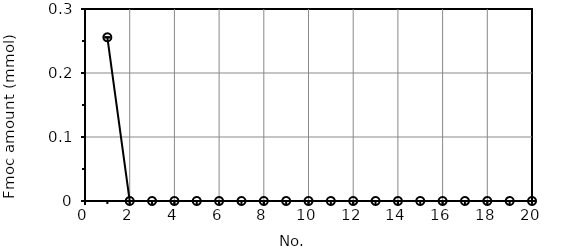
| Category | 01 protected-Alphatomega (S) |
|---|---|
| 1.0 | 0.256 |
| 2.0 | 0 |
| 3.0 | 0 |
| 4.0 | 0 |
| 5.0 | 0 |
| 6.0 | 0 |
| 7.0 | 0 |
| 8.0 | 0 |
| 9.0 | 0 |
| 10.0 | 0 |
| 11.0 | 0 |
| 12.0 | 0 |
| 13.0 | 0 |
| 14.0 | 0 |
| 15.0 | 0 |
| 16.0 | 0 |
| 17.0 | 0 |
| 18.0 | 0 |
| 19.0 | 0 |
| 20.0 | 0 |